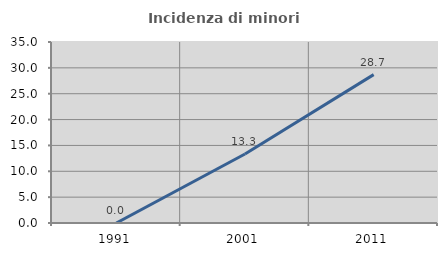
| Category | Incidenza di minori stranieri |
|---|---|
| 1991.0 | 0 |
| 2001.0 | 13.333 |
| 2011.0 | 28.689 |